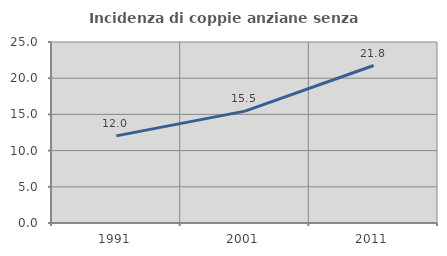
| Category | Incidenza di coppie anziane senza figli  |
|---|---|
| 1991.0 | 12.034 |
| 2001.0 | 15.45 |
| 2011.0 | 21.751 |